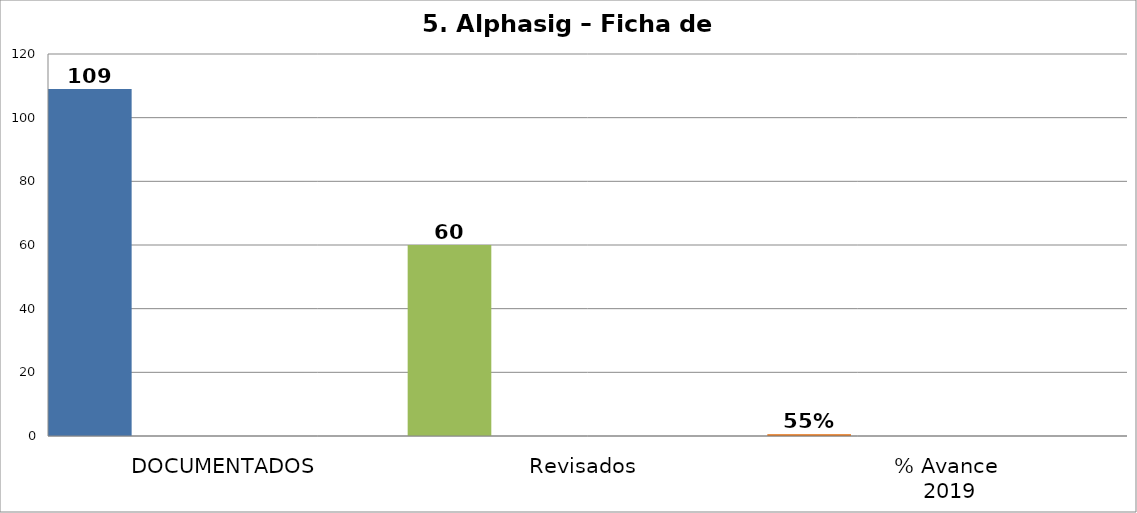
| Category | Series 0 | Series 1 | Series 2 | Series 3 | Series 4 | Series 5 | Series 6 |
|---|---|---|---|---|---|---|---|
| DOCUMENTADOS | 109 |  |  |  |  |  |  |
| Revisados | 60 |  |  |  |  |  |  |
| % Avance
 2019 | 0.55 |  |  |  |  |  |  |